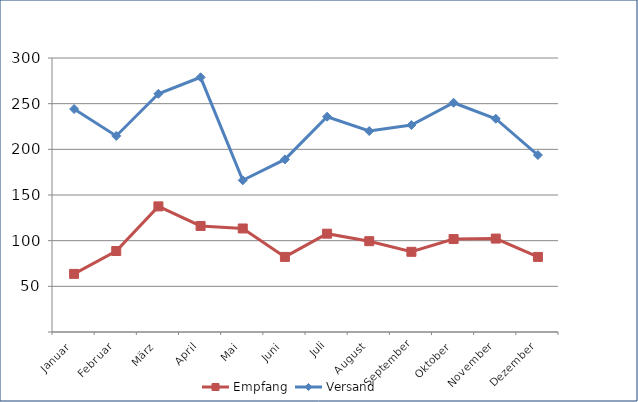
| Category | Empfang | Versand |
|---|---|---|
| Januar | 63.636 | 244.116 |
| Februar | 88.658 | 214.661 |
| März | 137.541 | 260.79 |
| April | 116.109 | 278.86 |
| Mai | 113.355 | 166.089 |
| Juni | 82.233 | 188.948 |
| Juli | 107.649 | 235.715 |
| August | 99.433 | 220.061 |
| September | 87.806 | 226.57 |
| Oktober | 101.783 | 250.991 |
| November | 102.288 | 233.502 |
| Dezember | 82.208 | 193.711 |